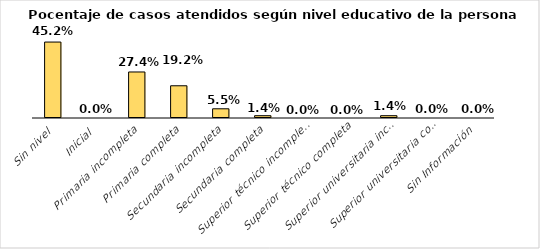
| Category | Series 0 |
|---|---|
| Sin nivel | 0.452 |
| Inicial | 0 |
| Primaria incompleta | 0.274 |
| Primaria completa | 0.192 |
| Secundaria incompleta | 0.055 |
| Secundaria completa | 0.014 |
| Superior técnico incompleta | 0 |
| Superior técnico completa | 0 |
| Superior universitaria incompleta | 0.014 |
| Superior universitaria completo | 0 |
| Sin Información | 0 |